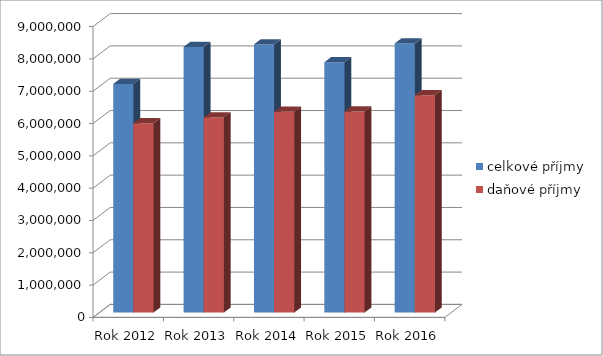
| Category | celkové příjmy | daňové příjmy |
|---|---|---|
| Rok 2012 | 7077264 | 5860476 |
| Rok 2013 | 8223972 | 6042400 |
| Rok 2014 | 8301489 | 6216584 |
| Rok 2015 | 7748013 | 6222474 |
| Rok 2016 | 8330191 | 6726341 |